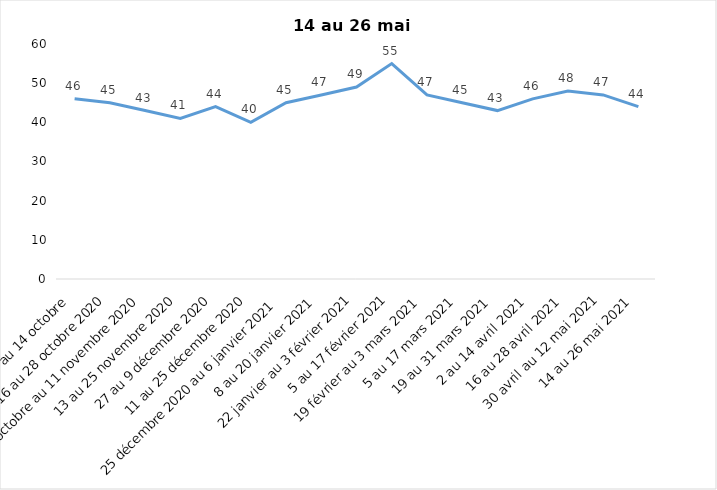
| Category | Toujours aux trois mesures |
|---|---|
| 2 au 14 octobre  | 46 |
| 16 au 28 octobre 2020 | 45 |
| 30 octobre au 11 novembre 2020 | 43 |
| 13 au 25 novembre 2020 | 41 |
| 27 au 9 décembre 2020 | 44 |
| 11 au 25 décembre 2020 | 40 |
| 25 décembre 2020 au 6 janvier 2021 | 45 |
| 8 au 20 janvier 2021 | 47 |
| 22 janvier au 3 février 2021 | 49 |
| 5 au 17 février 2021 | 55 |
| 19 février au 3 mars 2021 | 47 |
| 5 au 17 mars 2021 | 45 |
| 19 au 31 mars 2021 | 43 |
| 2 au 14 avril 2021 | 46 |
| 16 au 28 avril 2021 | 48 |
| 30 avril au 12 mai 2021 | 47 |
| 14 au 26 mai 2021 | 44 |